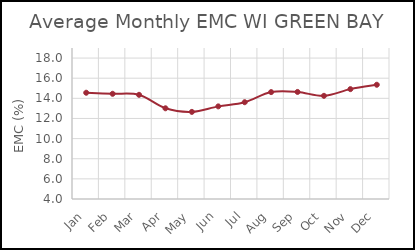
| Category | WI GREEN BAY |
|---|---|
| Jan | 14.556 |
| Feb | 14.451 |
| Mar | 14.35 |
| Apr | 13.01 |
| May | 12.654 |
| Jun | 13.201 |
| Jul | 13.615 |
| Aug | 14.619 |
| Sep | 14.635 |
| Oct | 14.25 |
| Nov | 14.914 |
| Dec | 15.349 |